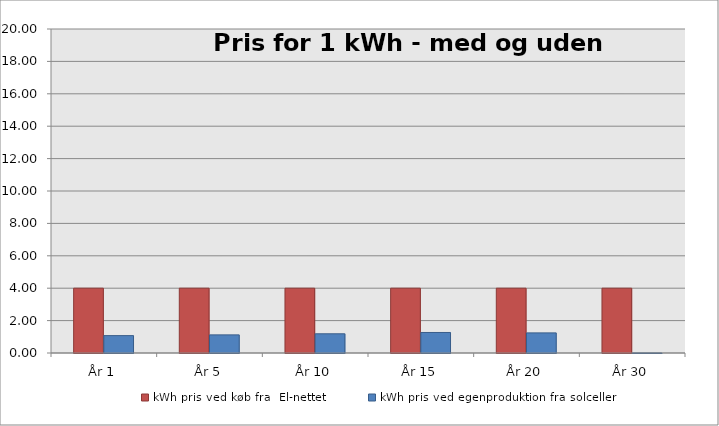
| Category | kWh pris ved køb fra  El-nettet | kWh pris ved egenproduktion fra solceller |
|---|---|---|
| År 1 | 4 | 1.073 |
| År 5 | 4 | 1.118 |
| År 10 | 4 | 1.185 |
| År 15 | 4 | 1.267 |
| År 20 | 4 | 1.241 |
| År 30 | 4 | 0 |